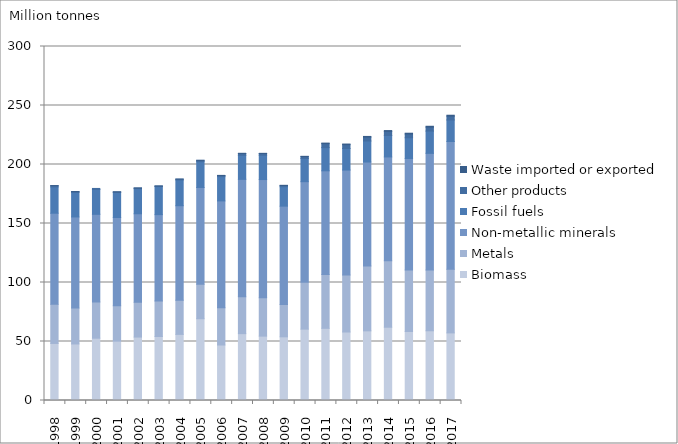
| Category | Biomass | Metals  | Non-metallic minerals | Fossil fuels | Other products | Waste imported or exported |
|---|---|---|---|---|---|---|
| 1998.0 | 48.352 | 33.124 | 77.234 | 22.307 | 1.083 | 0 |
| 1999.0 | 47.914 | 30.373 | 77.263 | 20.74 | 0.784 | 0 |
| 2000.0 | 52.793 | 30.749 | 74.22 | 21.066 | 0.882 | 0 |
| 2001.0 | 50.279 | 29.982 | 74.843 | 21.147 | 0.553 | 0 |
| 2002.0 | 53.752 | 29.421 | 75.081 | 21.298 | 0.531 | 0.002 |
| 2003.0 | 54.246 | 30.173 | 73.097 | 23.796 | 0.472 | 0.002 |
| 2004.0 | 56.031 | 28.995 | 80.051 | 21.838 | 0.702 | 0.002 |
| 2005.0 | 69.298 | 29.115 | 82.129 | 21.876 | 1.108 | 0.017 |
| 2006.0 | 47.033 | 31.629 | 90.495 | 20.558 | 1.006 | 0.008 |
| 2007.0 | 56.66 | 31.276 | 99.466 | 20.378 | 1.629 | 0.013 |
| 2008.0 | 54.553 | 32.553 | 100.126 | 20.614 | 1.537 | 0.027 |
| 2009.0 | 53.97 | 27.403 | 83.328 | 16.476 | 1.024 | 0.156 |
| 2010.0 | 60.472 | 39.747 | 85.219 | 19.63 | 1.573 | 0.29 |
| 2011.0 | 61.164 | 45.578 | 87.908 | 19.643 | 3.384 | 0.46 |
| 2012.0 | 58.054 | 48.252 | 88.97 | 18.269 | 3.263 | 0.534 |
| 2013.0 | 59.028 | 55.01 | 88.057 | 17.798 | 3.334 | 0.56 |
| 2014.0 | 62.101 | 56.273 | 88.018 | 18.189 | 3.507 | 0.667 |
| 2015.0 | 58.48 | 52.13 | 94.499 | 17.548 | 3.187 | 0.671 |
| 2016.0 | 59.093 | 51.509 | 98.845 | 18.861 | 3.379 | 0.712 |
| 2017.0 | 57.287 | 53.889 | 108.29 | 18.27 | 3.265 | 0.756 |